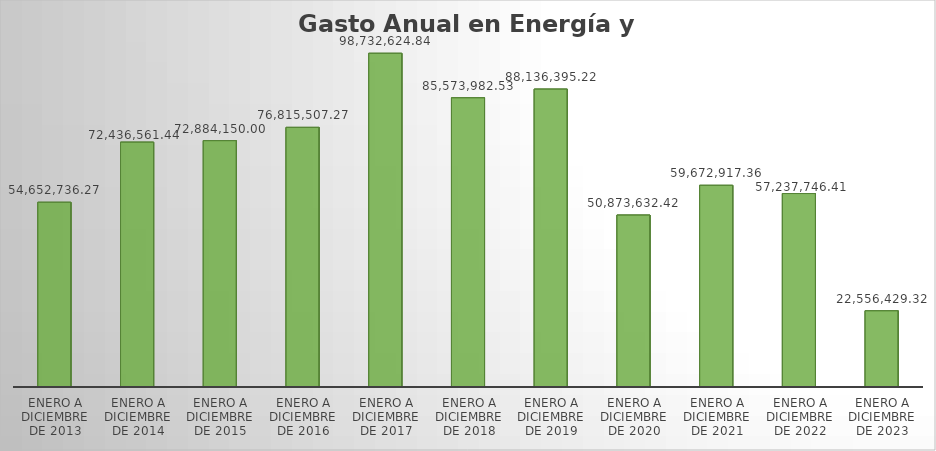
| Category | GASTO TOTAL |
|---|---|
| ENERO A DICIEMBRE DE 2013 | 54652736.27 |
| ENERO A DICIEMBRE DE 2014 | 72436561.44 |
| ENERO A DICIEMBRE DE 2015 | 72884150 |
| ENERO A DICIEMBRE DE 2016 | 76815507.27 |
| ENERO A DICIEMBRE DE 2017 | 98732624.84 |
| ENERO A DICIEMBRE DE 2018 | 85573982.53 |
| ENERO A DICIEMBRE DE 2019 | 88136395.22 |
| ENERO A DICIEMBRE DE 2020 | 50873632.42 |
| ENERO A DICIEMBRE DE 2021 | 59672917.36 |
| ENERO A DICIEMBRE DE 2022 | 57237746.41 |
| ENERO A DICIEMBRE DE 2023 | 22556429.32 |